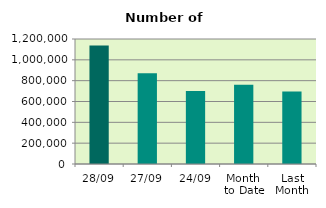
| Category | Series 0 |
|---|---|
| 28/09 | 1136754 |
| 27/09 | 871396 |
| 24/09 | 701826 |
| Month 
to Date | 761375.3 |
| Last
Month | 695004.455 |